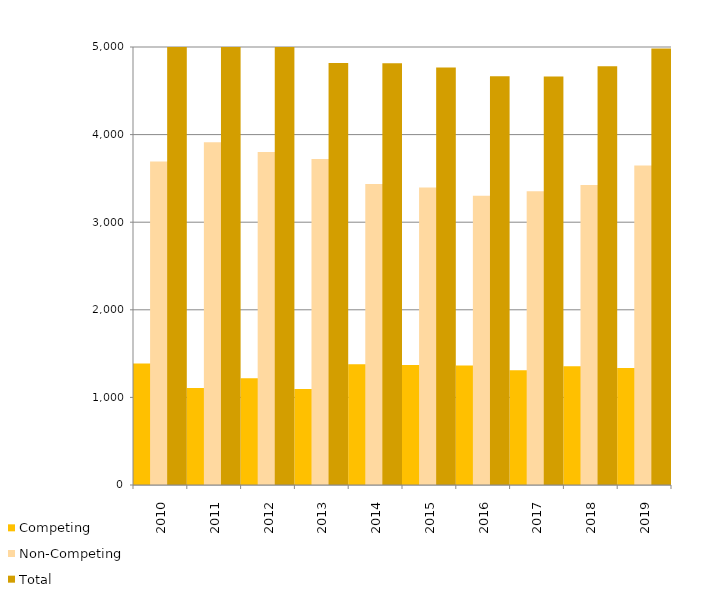
| Category | Competing  | Non-Competing    | Total |
|---|---|---|---|
| 2010.0 | 1387 | 3692 | 5079 |
| 2011.0 | 1106 | 3913 | 5019 |
| 2012.0 | 1220 | 3801 | 5021 |
| 2013.0 | 1095 | 3721 | 4816 |
| 2014.0 | 1378 | 3436 | 4814 |
| 2015.0 | 1371 | 3396 | 4767 |
| 2016.0 | 1365 | 3301 | 4666 |
| 2017.0 | 1311 | 3352 | 4663 |
| 2018.0 | 1356 | 3424 | 4780 |
| 2019.0 | 1336 | 3648 | 4984 |